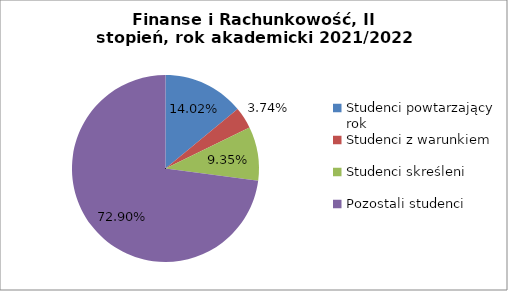
| Category | Series 0 |
|---|---|
| Studenci powtarzający rok | 15 |
| Studenci z warunkiem | 4 |
| Studenci skreśleni | 10 |
| Pozostali studenci | 78 |